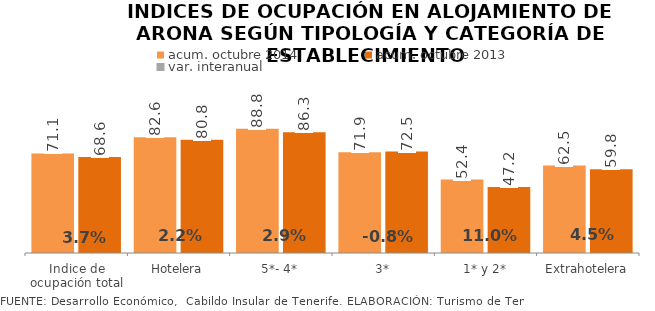
| Category | acum. octubre 2014 | acum. octubre 2013 |
|---|---|---|
| Indice de ocupación total | 71.119 | 68.611 |
| Hotelera | 82.597 | 80.847 |
| 5*- 4* | 88.778 | 86.308 |
| 3* | 71.912 | 72.469 |
| 1* y 2* | 52.411 | 47.227 |
| Extrahotelera | 62.495 | 59.815 |